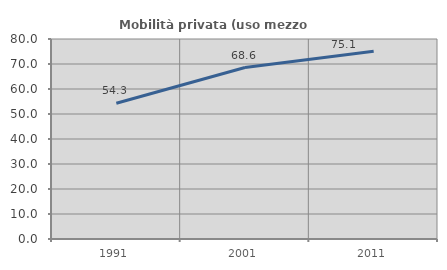
| Category | Mobilità privata (uso mezzo privato) |
|---|---|
| 1991.0 | 54.283 |
| 2001.0 | 68.586 |
| 2011.0 | 75.132 |